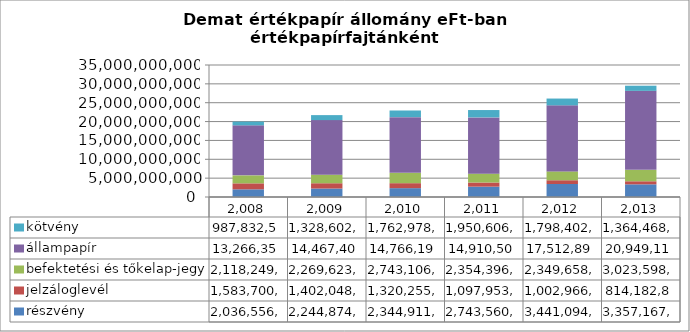
| Category | részvény | jelzáloglevél | befektetési és tőkelap-jegy | állampapír | kötvény |
|---|---|---|---|---|---|
| 2008.0 | 2036556683.939 | 1583700646.76 | 2118249234.376 | 13266351130 | 987832574.947 |
| 2009.0 | 2244874432 | 1402048180 | 2269623795 | 14467402330 | 1328602759 |
| 2010.0 | 2344911567 | 1320255675 | 2743106103 | 14766198820 | 1762978607 |
| 2011.0 | 2743560292.047 | 1097953560 | 2354396370.134 | 14910504960 | 1950606550.931 |
| 2012.0 | 3441094149.807 | 1002966515 | 2349658948.344 | 17512891870 | 1798402468.727 |
| 2013.0 | 3357167890.812 | 814182814 | 3023598482.767 | 20949115825 | 1364468629.657 |